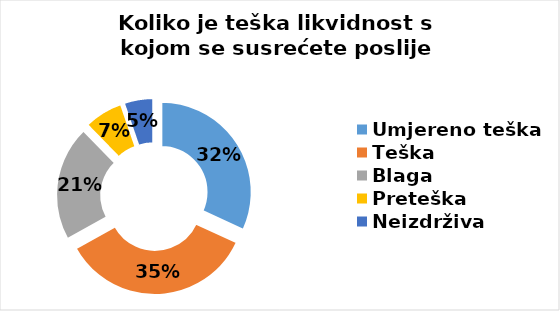
| Category | Series 0 |
|---|---|
| Umjereno teška | 109 |
| Teška | 120 |
| Blaga | 71 |
| Preteška | 24 |
| Neizdrživa | 18 |